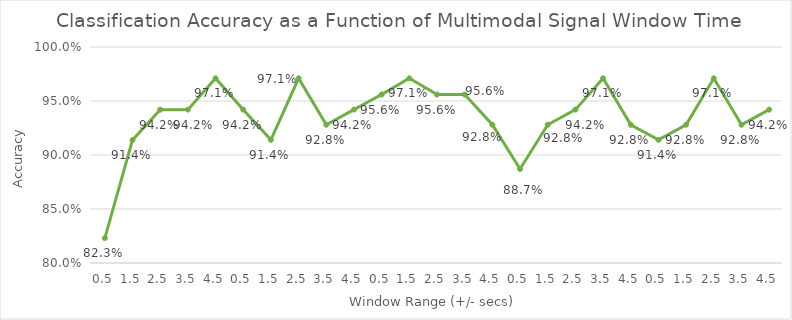
| Category | Window Range (+/- secs) |
|---|---|
| 0.5 | 0.823 |
| 1.5 | 0.914 |
| 2.5 | 0.942 |
| 3.5 | 0.942 |
| 4.5 | 0.971 |
| 0.5 | 0.942 |
| 1.5 | 0.914 |
| 2.5 | 0.971 |
| 3.5 | 0.928 |
| 4.5 | 0.942 |
| 0.5 | 0.956 |
| 1.5 | 0.971 |
| 2.5 | 0.956 |
| 3.5 | 0.956 |
| 4.5 | 0.928 |
| 0.5 | 0.887 |
| 1.5 | 0.928 |
| 2.5 | 0.942 |
| 3.5 | 0.971 |
| 4.5 | 0.928 |
| 0.5 | 0.914 |
| 1.5 | 0.928 |
| 2.5 | 0.971 |
| 3.5 | 0.928 |
| 4.5 | 0.942 |